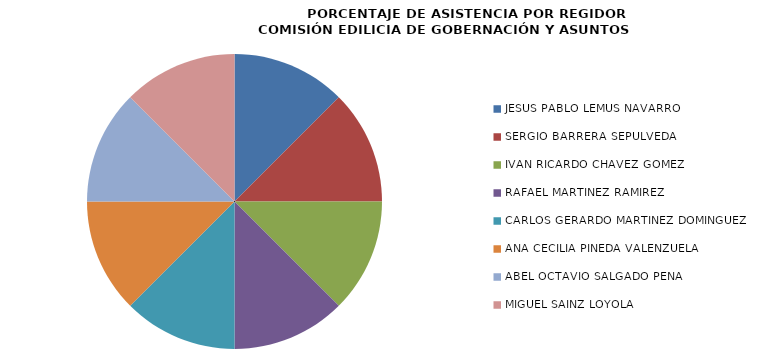
| Category | Series 0 |
|---|---|
| JESÚS PABLO LEMUS NAVARRO | 100 |
| SERGIO BARRERA SEPÚLVEDA | 100 |
| IVÁN RICARDO CHÁVEZ GÓMEZ | 100 |
| RAFAEL MARTÍNEZ RAMÍREZ | 100 |
| CARLOS GERARDO MARTÍNEZ DOMÍNGUEZ | 100 |
| ANA CECILIA PINEDA VALENZUELA | 100 |
| ABEL OCTAVIO SALGADO PEÑA | 100 |
| MIGUEL SAINZ LOYOLA | 100 |